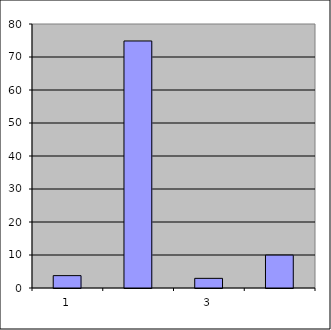
| Category | Series 0 |
|---|---|
| 0 | 3.75 |
| 1 | 74.857 |
| 2 | 2.925 |
| 3 | 9.972 |